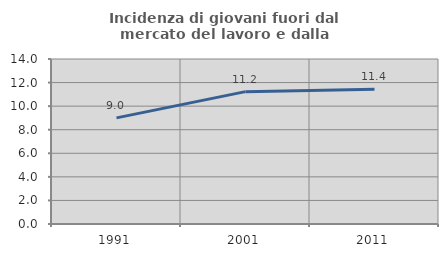
| Category | Incidenza di giovani fuori dal mercato del lavoro e dalla formazione  |
|---|---|
| 1991.0 | 9.002 |
| 2001.0 | 11.23 |
| 2011.0 | 11.429 |